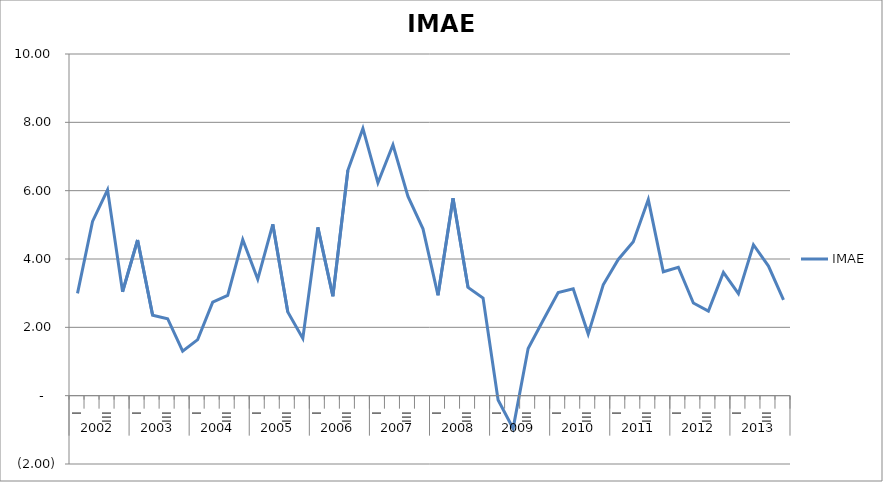
| Category | IMAE |
|---|---|
| 0 | 2.996 |
| 1 | 5.099 |
| 2 | 6.026 |
| 3 | 3.042 |
| 4 | 4.556 |
| 5 | 2.356 |
| 6 | 2.253 |
| 7 | 1.302 |
| 8 | 1.639 |
| 9 | 2.737 |
| 10 | 2.933 |
| 11 | 4.567 |
| 12 | 3.408 |
| 13 | 5.015 |
| 14 | 2.452 |
| 15 | 1.676 |
| 16 | 4.925 |
| 17 | 2.909 |
| 18 | 6.596 |
| 19 | 7.822 |
| 20 | 6.231 |
| 21 | 7.343 |
| 22 | 5.833 |
| 23 | 4.884 |
| 24 | 2.936 |
| 25 | 5.777 |
| 26 | 3.169 |
| 27 | 2.857 |
| 28 | -0.126 |
| 29 | -0.958 |
| 30 | 1.381 |
| 31 | 2.207 |
| 32 | 3.017 |
| 33 | 3.129 |
| 34 | 1.803 |
| 35 | 3.245 |
| 36 | 3.987 |
| 37 | 4.506 |
| 38 | 5.738 |
| 39 | 3.625 |
| 40 | 3.759 |
| 41 | 2.711 |
| 42 | 2.476 |
| 43 | 3.606 |
| 44 | 2.986 |
| 45 | 4.417 |
| 46 | 3.794 |
| 47 | 2.806 |